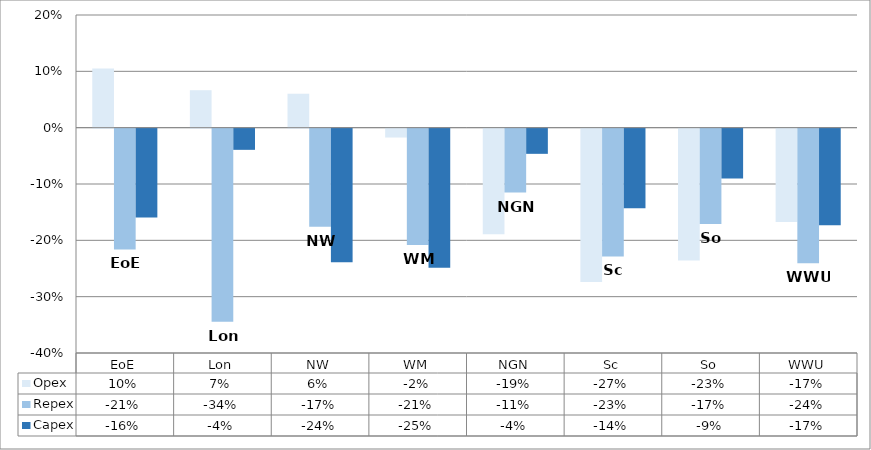
| Category | Opex | Repex | Capex |
|---|---|---|---|
| 0 | 0.105 | -0.214 | -0.158 |
| 1 | 0.066 | -0.343 | -0.038 |
| 2 | 0.06 | -0.174 | -0.237 |
| 3 | -0.016 | -0.207 | -0.247 |
| 4 | -0.188 | -0.113 | -0.045 |
| 5 | -0.272 | -0.227 | -0.141 |
| 6 | -0.234 | -0.169 | -0.088 |
| 7 | -0.166 | -0.239 | -0.172 |